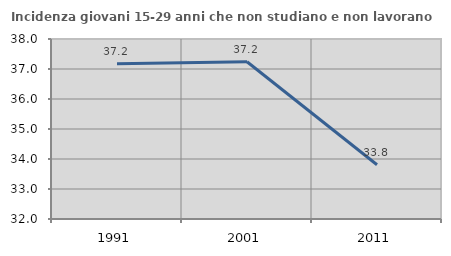
| Category | Incidenza giovani 15-29 anni che non studiano e non lavorano  |
|---|---|
| 1991.0 | 37.174 |
| 2001.0 | 37.241 |
| 2011.0 | 33.808 |